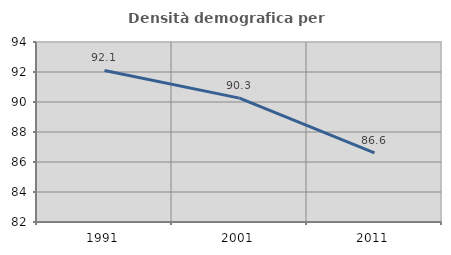
| Category | Densità demografica |
|---|---|
| 1991.0 | 92.103 |
| 2001.0 | 90.257 |
| 2011.0 | 86.614 |